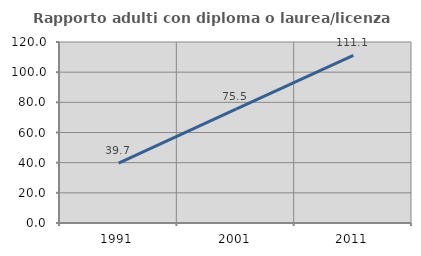
| Category | Rapporto adulti con diploma o laurea/licenza media  |
|---|---|
| 1991.0 | 39.721 |
| 2001.0 | 75.516 |
| 2011.0 | 111.082 |